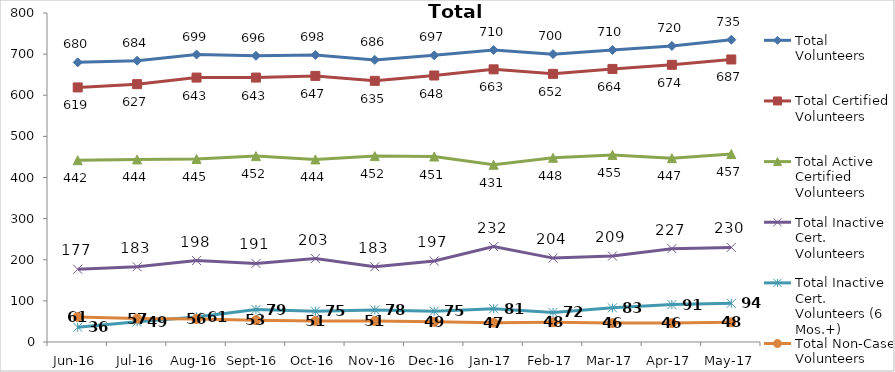
| Category | Total Volunteers | Total Certified Volunteers | Total Active Certified Volunteers | Total Inactive Cert. Volunteers | Total Inactive Cert. Volunteers (6 Mos.+) | Total Non-Case Volunteers |
|---|---|---|---|---|---|---|
| Jun-16 | 680 | 619 | 442 | 177 | 36 | 61 |
| Jul-16 | 684 | 627 | 444 | 183 | 49 | 57 |
| Aug-16 | 699 | 643 | 445 | 198 | 61 | 56 |
| Sep-16 | 696 | 643 | 452 | 191 | 79 | 53 |
| Oct-16 | 698 | 647 | 444 | 203 | 75 | 51 |
| Nov-16 | 686 | 635 | 452 | 183 | 78 | 51 |
| Dec-16 | 697 | 648 | 451 | 197 | 75 | 49 |
| Jan-17 | 710 | 663 | 431 | 232 | 81 | 47 |
| Feb-17 | 700 | 652 | 448 | 204 | 72 | 48 |
| Mar-17 | 710 | 664 | 455 | 209 | 83 | 46 |
| Apr-17 | 720 | 674 | 447 | 227 | 91 | 46 |
| May-17 | 735 | 687 | 457 | 230 | 94 | 48 |